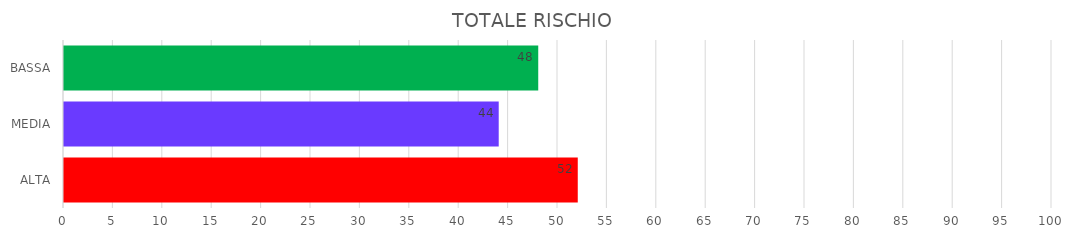
| Category | Series 1 | Series 0 |
|---|---|---|
| ALTA | 52 | 52 |
| MEDIA | 44 | 44 |
| BASSA | 48 | 48 |